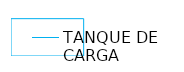
| Category | TANQUE DE CARGA |
|---|---|
| 0.0 | 0 |
| 1.0 | 0 |
| 1.0 | 1 |
| 0.0 | 1 |
| 0.0 | 0 |